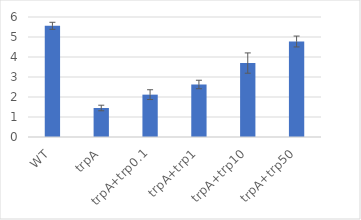
| Category | Series 0 |
|---|---|
| WT | 5.56 |
| trpA | 1.45 |
| trpA+trp0.1 | 2.118 |
| trpA+trp1 | 2.625 |
| trpA+trp10 | 3.697 |
| trpA+trp50 | 4.775 |